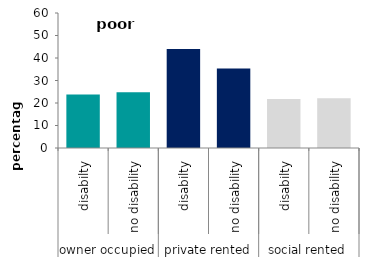
| Category | poor housing |
|---|---|
| 0 | 23.763 |
| 1 | 24.777 |
| 2 | 44.03 |
| 3 | 35.367 |
| 4 | 21.764 |
| 5 | 22.131 |